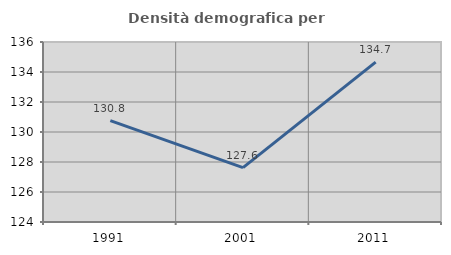
| Category | Densità demografica |
|---|---|
| 1991.0 | 130.761 |
| 2001.0 | 127.622 |
| 2011.0 | 134.656 |